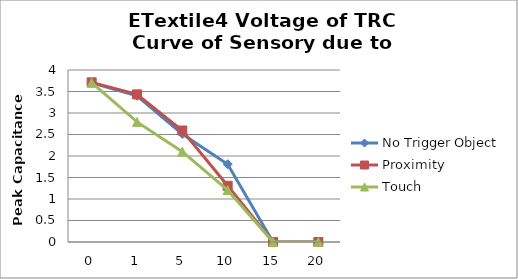
| Category | No Trigger Object | Proximity | Touch |
|---|---|---|---|
| 0.0 | 3.705 | 3.713 | 3.705 |
| 1.0 | 3.401 | 3.433 | 2.793 |
| 5.0 | 2.513 | 2.593 | 2.101 |
| 10.0 | 1.809 | 1.307 | 1.209 |
| 15.0 | 0 | 0 | 0 |
| 20.0 | 0 | 0 | 0 |